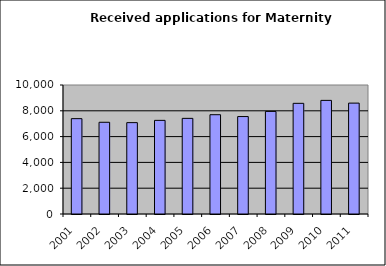
| Category | Series 1 |
|---|---|
| 2001.0 | 7392 |
| 2002.0 | 7111 |
| 2003.0 | 7083 |
| 2004.0 | 7258 |
| 2005.0 | 7413 |
| 2006.0 | 7697 |
| 2007.0 | 7554 |
| 2008.0 | 7952 |
| 2009.0 | 8579 |
| 2010.0 | 8808 |
| 2011.0 | 8595 |